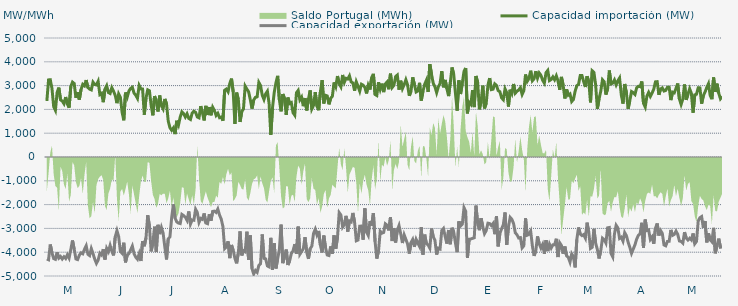
| Category | Capacidad importación (MW) | Capacidad exportación (MW) |
|---|---|---|
| 0 | 2355.417 | -4288.125 |
| 1900-01-01 | 3240.75 | -4318.125 |
| 1900-01-02 | 3247.5 | -3676.875 |
| 1900-01-03 | 2878.042 | -4025.625 |
| 1900-01-04 | 2109.167 | -4269.375 |
| 1900-01-05 | 1961.042 | -4299.375 |
| 1900-01-06 | 2710.208 | -4003.125 |
| 1900-01-07 | 2916 | -4248.333 |
| 1900-01-08 | 2401.875 | -4179.375 |
| 1900-01-09 | 2351.25 | -4286.25 |
| 1900-01-10 | 2238.75 | -4192.5 |
| 1900-01-11 | 2520 | -4265.625 |
| 1900-01-12 | 2227.5 | -4108.125 |
| 1900-01-13 | 2070.583 | -4246.875 |
| 1900-01-14 | 2958.75 | -3892.5 |
| 1900-01-15 | 3146.25 | -3508.125 |
| 1900-01-16 | 3087.5 | -3877.5 |
| 1900-01-17 | 2487.5 | -4284.375 |
| 1900-01-18 | 2722.5 | -4310.625 |
| 1900-01-19 | 2411.25 | -4125 |
| 1900-01-20 | 2840.5 | -4025.625 |
| 1900-01-21 | 3054.5 | -4066.875 |
| 1900-01-22 | 2992.958 | -3879.375 |
| 1900-01-23 | 3232.5 | -3729.375 |
| 1900-01-24 | 2917.5 | -4085.625 |
| 1900-01-25 | 2853.75 | -4141.875 |
| 1900-01-26 | 2819.458 | -3849.375 |
| 1900-01-27 | 3145.042 | -4061.25 |
| 1900-01-28 | 3046.958 | -4290 |
| 1900-01-29 | 3028.125 | -4468.125 |
| 1900-01-30 | 3180.542 | -4331.25 |
| 1900-01-31 | 2624.958 | -4042.5 |
| 1900-02-01 | 2676.25 | -4115.625 |
| 1900-02-02 | 2302.5 | -3873.75 |
| 1900-02-03 | 2854.208 | -4308.75 |
| 1900-02-04 | 2997.833 | -3837.167 |
| 1900-02-05 | 2709.375 | -3973.125 |
| 1900-02-06 | 2670 | -3712.958 |
| 1900-02-07 | 2913.75 | -3958.125 |
| 1900-02-08 | 2765.625 | -4134.375 |
| 1900-02-09 | 2587.5 | -3352.5 |
| 1900-02-10 | 2261.25 | -3093.75 |
| 1900-02-11 | 2651.25 | -3345.208 |
| 1900-02-12 | 2510.625 | -3963.75 |
| 1900-02-13 | 1885.875 | -4044.375 |
| 1900-02-14 | 1541.5 | -3601.375 |
| 1900-02-15 | 2707.5 | -4426.875 |
| 1900-02-16 | 2516.25 | -4128.75 |
| 1900-02-17 | 2775 | -4059.375 |
| 1900-02-18 | 2883.75 | -3906.667 |
| 1900-02-19 | 2930.625 | -3742.5 |
| 1900-02-20 | 2685 | -4061.25 |
| 1900-02-21 | 2596.875 | -4213.125 |
| 1900-02-22 | 2463.75 | -4295.625 |
| 1900-02-23 | 3005.625 | -4065 |
| 1900-02-24 | 2861.25 | -4370.625 |
| 1900-02-25 | 2855.083 | -3533.583 |
| 1900-02-26 | 1775.625 | -3751.875 |
| 1900-02-27 | 2478.75 | -3391.875 |
| 1900-02-28 | 2821.875 | -2444.375 |
| 1900-02-28 | 2782.5 | -2903.75 |
| 1900-03-01 | 2169.375 | -3964.667 |
| 1900-03-02 | 1751.292 | -3614.625 |
| 1900-03-03 | 2561.25 | -2926.875 |
| 1900-03-04 | 2356.875 | -3995.625 |
| 1900-03-05 | 1911.125 | -2849.625 |
| 1900-03-06 | 2583.75 | -3240 |
| 1900-03-07 | 2157.125 | -2962.917 |
| 1900-03-08 | 2021.375 | -3195.625 |
| 1900-03-09 | 2439.375 | -3776.25 |
| 1900-03-10 | 2235 | -4305 |
| 1900-03-11 | 1509.375 | -3436.875 |
| 1900-03-12 | 1230.208 | -3360 |
| 1900-03-13 | 1123.125 | -2546.875 |
| 1900-03-14 | 1221.25 | -1995.875 |
| 1900-03-15 | 962.083 | -2563.125 |
| 1900-03-16 | 1523.958 | -2728.125 |
| 1900-03-17 | 1344.375 | -2776.875 |
| 1900-03-18 | 1676.25 | -2795.625 |
| 1900-03-19 | 1899.375 | -2411.25 |
| 1900-03-20 | 1826.25 | -2461.875 |
| 1900-03-21 | 1680 | -2529.375 |
| 1900-03-22 | 1815 | -2662.5 |
| 1900-03-23 | 1621.458 | -2287.5 |
| 1900-03-24 | 1577.083 | -2818.125 |
| 1900-03-25 | 1846.875 | -2643.75 |
| 1900-03-26 | 1923.75 | -2656.875 |
| 1900-03-27 | 1875 | -2195.625 |
| 1900-03-28 | 1683.75 | -2330.625 |
| 1900-03-29 | 1646.25 | -2746.875 |
| 1900-03-30 | 2137.5 | -2580.5 |
| 1900-03-31 | 1860 | -2620.625 |
| 1900-04-01 | 1537.5 | -2371.875 |
| 1900-04-02 | 2149.292 | -2771.25 |
| 1900-04-03 | 1766.25 | -2801.25 |
| 1900-04-04 | 2097.75 | -2405.625 |
| 1900-04-05 | 1753.125 | -2676.75 |
| 1900-04-06 | 2090.625 | -2285.292 |
| 1900-04-07 | 1956.125 | -2274.75 |
| 1900-04-08 | 1743.75 | -2330.125 |
| 1900-04-09 | 1833.75 | -2185.875 |
| 1900-04-10 | 1651.875 | -2439.375 |
| 1900-04-11 | 1677 | -2608.125 |
| 1900-04-12 | 1526.25 | -2926.875 |
| 1900-04-13 | 2806.875 | -3847.5 |
| 1900-04-14 | 2853.75 | -3770.625 |
| 1900-04-15 | 2739.375 | -3542.5 |
| 1900-04-16 | 3086.25 | -4248.75 |
| 1900-04-17 | 3294.375 | -3694.583 |
| 1900-04-18 | 2737.5 | -3914.167 |
| 1900-04-19 | 1388.958 | -4258.125 |
| 1900-04-20 | 2705.625 | -4468.125 |
| 1900-04-21 | 2414.25 | -4032.292 |
| 1900-04-22 | 1474.5 | -3127.5 |
| 1900-04-23 | 1904.833 | -4134.375 |
| 1900-04-24 | 2018.333 | -3933.75 |
| 1900-04-25 | 2978.625 | -3980.625 |
| 1900-04-26 | 2851.875 | -3137.917 |
| 1900-04-27 | 2745 | -4327.5 |
| 1900-04-28 | 2411.25 | -3294.375 |
| 1900-04-29 | 2032.5 | -4693.125 |
| 1900-04-30 | 2394.375 | -4916.25 |
| 1900-05-01 | 2506.875 | -4770 |
| 1900-05-02 | 2527.5 | -4845 |
| 1900-05-03 | 3132.875 | -4556.25 |
| 1900-05-04 | 3001.875 | -4479.375 |
| 1900-05-05 | 2597 | -3253.75 |
| 1900-05-06 | 2415.833 | -4258.125 |
| 1900-05-07 | 2655 | -4284.375 |
| 1900-05-08 | 2764.458 | -4576.875 |
| 1900-05-09 | 2248.625 | -4616.25 |
| 1900-05-10 | 931.875 | -3396.042 |
| 1900-05-11 | 2074.792 | -4740 |
| 1900-05-12 | 2707.5 | -3624.375 |
| 1900-05-13 | 3118.125 | -4681.875 |
| 1900-05-14 | 3408.75 | -4280.625 |
| 1900-05-15 | 2415 | -3889.583 |
| 1900-05-16 | 1918.917 | -2840.25 |
| 1900-05-17 | 2645.125 | -4460.625 |
| 1900-05-18 | 2469.792 | -4186.875 |
| 1900-05-19 | 1772.542 | -3887.917 |
| 1900-05-20 | 2498.667 | -4538.125 |
| 1900-05-21 | 2245.542 | -4370 |
| 1900-05-22 | 2285.625 | -4056.25 |
| 1900-05-23 | 1862.708 | -3941.667 |
| 1900-05-24 | 1755.417 | -3663.125 |
| 1900-05-25 | 2699.583 | -4063.125 |
| 1900-05-26 | 2797.5 | -2925.625 |
| 1900-05-27 | 2403.333 | -4085.625 |
| 1900-05-28 | 2516.25 | -3971.25 |
| 1900-05-29 | 2135.625 | -3854.792 |
| 1900-05-30 | 2477.125 | -3369.292 |
| 1900-05-31 | 1956.292 | -3999.375 |
| 1900-06-01 | 2427.5 | -4280 |
| 1900-06-02 | 2798 | -3856.875 |
| 1900-06-03 | 2018.125 | -3744.583 |
| 1900-06-04 | 2168.958 | -3208.75 |
| 1900-06-05 | 2728.125 | -3034.375 |
| 1900-06-06 | 2131.75 | -3278.125 |
| 1900-06-07 | 1966.875 | -3106.458 |
| 1900-06-08 | 2738.083 | -3703.375 |
| 1900-06-09 | 3229.167 | -4012.5 |
| 1900-06-10 | 2249.792 | -3300.833 |
| 1900-06-11 | 2592.917 | -3809.792 |
| 1900-06-12 | 2566.25 | -4116.667 |
| 1900-06-13 | 2212.5 | -4138.708 |
| 1900-06-14 | 2464.375 | -3755.833 |
| 1900-06-15 | 2551.042 | -4061.25 |
| 1900-06-16 | 3133.5 | -3295.833 |
| 1900-06-17 | 2953.75 | -3854.167 |
| 1900-06-18 | 3401.25 | -3375.917 |
| 1900-06-19 | 3082.5 | -2336.25 |
| 1900-06-20 | 2949.375 | -2439.375 |
| 1900-06-21 | 3446.25 | -2947.5 |
| 1900-06-22 | 3138.75 | -2840.625 |
| 1900-06-23 | 3305 | -2472.958 |
| 1900-06-24 | 3276.125 | -3134.625 |
| 1900-06-25 | 3410.625 | -2685.417 |
| 1900-06-26 | 3153.75 | -2727.292 |
| 1900-06-27 | 3110.625 | -2351.25 |
| 1900-06-28 | 2786.458 | -2737.5 |
| 1900-06-29 | 3159.375 | -3519.375 |
| 1900-06-30 | 2974.6 | -3488.4 |
| 1900-07-01 | 2766.667 | -2906.917 |
| 1900-07-02 | 3058.125 | -2902.5 |
| 1900-07-03 | 3018.75 | -3474.375 |
| 1900-07-04 | 2925.625 | -2158.375 |
| 1900-07-05 | 2670.667 | -3157.5 |
| 1900-07-06 | 3015 | -3296.25 |
| 1900-07-07 | 2835.25 | -2693.125 |
| 1900-07-08 | 3337.5 | -2882.083 |
| 1900-07-09 | 3493.125 | -2358.75 |
| 1900-07-10 | 2626.042 | -3555 |
| 1900-07-11 | 2583.542 | -4267.5 |
| 1900-07-12 | 3140.625 | -3948.75 |
| 1900-07-13 | 2844.375 | -3122.5 |
| 1900-07-14 | 3082.5 | -3200.625 |
| 1900-07-15 | 2726.25 | -3170.625 |
| 1900-07-16 | 3071.25 | -2806.875 |
| 1900-07-17 | 3151.875 | -2865 |
| 1900-07-18 | 2845.417 | -3084.375 |
| 1900-07-19 | 3500.625 | -2536.875 |
| 1900-07-20 | 2921.75 | -3531.625 |
| 1900-07-21 | 3012.625 | -2985.75 |
| 1900-07-22 | 3378.75 | -3590.625 |
| 1900-07-23 | 3442.5 | -3078.75 |
| 1900-07-24 | 2829.167 | -2881.042 |
| 1900-07-25 | 3205.833 | -3234.375 |
| 1900-07-26 | 2873.625 | -3613.125 |
| 1900-07-27 | 3038.333 | -3270 |
| 1900-07-28 | 3245.625 | -3459.375 |
| 1900-07-29 | 3029.167 | -3656.25 |
| 1900-07-30 | 2571.042 | -4057.5 |
| 1900-07-31 | 2766.125 | -3596.417 |
| 1900-08-01 | 3348.75 | -3465 |
| 1900-08-02 | 3046.333 | -3774.375 |
| 1900-08-03 | 2732.708 | -3460.042 |
| 1900-08-04 | 2770.75 | -3616.875 |
| 1900-08-05 | 3116.25 | -3757.75 |
| 1900-08-06 | 2370.5 | -2949.375 |
| 1900-08-07 | 2758.625 | -4102.5 |
| 1900-08-08 | 3054.167 | -3262.5 |
| 1900-08-09 | 3221.875 | -3637.5 |
| 1900-08-10 | 2734.792 | -3695.625 |
| 1900-08-11 | 3901.875 | -3830.625 |
| 1900-08-12 | 3478.125 | -3007.5 |
| 1900-08-13 | 3100.208 | -3343.125 |
| 1900-08-14 | 2951.458 | -3500.625 |
| 1900-08-15 | 2703.125 | -4100.625 |
| 1900-08-16 | 2949.667 | -3832.5 |
| 1900-08-17 | 3092.292 | -3864.375 |
| 1900-08-18 | 3609.375 | -3088.125 |
| 1900-08-19 | 2928.75 | -3003.75 |
| 1900-08-20 | 3238.333 | -3346.875 |
| 1900-08-21 | 2865.417 | -3639.375 |
| 1900-08-22 | 2557.917 | -3067.5 |
| 1900-08-23 | 3131.667 | -3665.625 |
| 1900-08-24 | 3761.25 | -2973.625 |
| 1900-08-25 | 3468.542 | -3153.75 |
| 1900-08-26 | 2673.75 | -3622.5 |
| 1900-08-27 | 1945.625 | -3999.375 |
| 1900-08-28 | 3222.083 | -2703.875 |
| 1900-08-29 | 2645.458 | -2900.625 |
| 1900-08-30 | 3097.5 | -2827.5 |
| 1900-08-31 | 3595.208 | -2128.75 |
| 1900-09-01 | 3741.458 | -2283.75 |
| 1900-09-02 | 1833.125 | -4242.5 |
| 1900-09-03 | 2294.25 | -3457.125 |
| 1900-09-04 | 2210.833 | -3444.375 |
| 1900-09-05 | 2808.75 | -3420 |
| 1900-09-06 | 2098.083 | -3391.875 |
| 1900-09-07 | 3404.792 | -2041.875 |
| 1900-09-08 | 3136.875 | -2790.292 |
| 1900-09-09 | 2001.25 | -3075.75 |
| 1900-09-10 | 2334.583 | -2570.625 |
| 1900-09-11 | 2998.542 | -2932.5 |
| 1900-09-12 | 2041.583 | -3219.375 |
| 1900-09-13 | 2261.875 | -3091.875 |
| 1900-09-14 | 3017.292 | -2780.625 |
| 1900-09-15 | 3316.667 | -2796 |
| 1900-09-16 | 2831.875 | -2880.375 |
| 1900-09-17 | 2848.875 | -2791.375 |
| 1900-09-18 | 3072.083 | -3242.5 |
| 1900-09-19 | 3008.75 | -2494.125 |
| 1900-09-20 | 2789.75 | -3753.75 |
| 1900-09-21 | 2740.75 | -3208.125 |
| 1900-09-22 | 2484.167 | -3015 |
| 1900-09-23 | 2405.083 | -2845.208 |
| 1900-09-24 | 2862.542 | -2330.625 |
| 1900-09-25 | 2704.875 | -3693.75 |
| 1900-09-26 | 2121.458 | -2932.25 |
| 1900-09-27 | 2826.875 | -2536.458 |
| 1900-09-28 | 2666.25 | -2617.875 |
| 1900-09-29 | 3068.375 | -2797.625 |
| 1900-09-30 | 2681.458 | -3181.875 |
| 1900-10-01 | 2762.167 | -3268.125 |
| 1900-10-02 | 2816.458 | -3403.125 |
| 1900-10-03 | 2908.75 | -3388.125 |
| 1900-10-04 | 2628.458 | -3817.5 |
| 1900-10-05 | 2784.5 | -3729.375 |
| 1900-10-06 | 3466.875 | -2575.375 |
| 1900-10-07 | 3180 | -3284.375 |
| 1900-10-08 | 3301.25 | -3251.25 |
| 1900-10-09 | 3624.375 | -3114.375 |
| 1900-10-10 | 3203.333 | -3733.125 |
| 1900-10-11 | 3288.125 | -4155 |
| 1900-10-12 | 3606.25 | -3943.125 |
| 1900-10-13 | 3313.75 | -3335.625 |
| 1900-10-14 | 3531.417 | -3646.875 |
| 1900-10-15 | 3433.125 | -3826.875 |
| 1900-10-16 | 3223.542 | -3673.333 |
| 1900-10-17 | 3103.75 | -4066.875 |
| 1900-10-18 | 3546.25 | -3496.875 |
| 1900-10-19 | 3638.5 | -3952.5 |
| 1900-10-20 | 3210 | -3661.875 |
| 1900-10-21 | 3255.417 | -3826.875 |
| 1900-10-22 | 3367.5 | -3690 |
| 1900-10-23 | 3244.5 | -3684.375 |
| 1900-10-24 | 3411.458 | -3435 |
| 1900-10-25 | 3192.708 | -4203.75 |
| 1900-10-26 | 2825 | -3605.625 |
| 1900-10-27 | 3365.667 | -3718.625 |
| 1900-10-28 | 3014.375 | -4063.125 |
| 1900-10-29 | 2458.292 | -3762 |
| 1900-10-30 | 2845.5 | -4151.25 |
| 1900-10-31 | 2597.292 | -4215 |
| 1900-11-01 | 2650.375 | -4415.625 |
| 1900-11-02 | 2331.042 | -4066.875 |
| 1900-11-03 | 2415.625 | -4185 |
| 1900-11-04 | 2763.875 | -4638.75 |
| 1900-11-05 | 2996.042 | -3465 |
| 1900-11-06 | 3054.375 | -2960.625 |
| 1900-11-07 | 3421.875 | -3238.875 |
| 1900-11-08 | 3422.25 | -3301.458 |
| 1900-11-09 | 3168.75 | -3257.708 |
| 1900-11-10 | 2940.75 | -3407.5 |
| 1900-11-11 | 3391.875 | -2758.75 |
| 1900-11-12 | 3159.375 | -3175.208 |
| 1900-11-13 | 2294.792 | -3843.75 |
| 1900-11-14 | 3620.625 | -3793.125 |
| 1900-11-15 | 3550.208 | -3016.875 |
| 1900-11-16 | 3036.458 | -3616.875 |
| 1900-11-17 | 2023.333 | -3886.25 |
| 1900-11-18 | 2440.208 | -4263.75 |
| 1900-11-19 | 2764.167 | -3943.125 |
| 1900-11-20 | 3245.625 | -3410.667 |
| 1900-11-21 | 3161.25 | -3470.625 |
| 1900-11-22 | 2621.458 | -3614.625 |
| 1900-11-23 | 2861.25 | -2975.958 |
| 1900-11-24 | 3635.217 | -2962.391 |
| 1900-11-25 | 3071.083 | -4052.75 |
| 1900-11-26 | 3103.625 | -4196.25 |
| 1900-11-27 | 3238.125 | -3235.75 |
| 1900-11-28 | 3031.875 | -2868.708 |
| 1900-11-29 | 3202.5 | -2981.292 |
| 1900-11-30 | 3320.625 | -3422.292 |
| 1900-12-01 | 2615.625 | -3370.417 |
| 1900-12-02 | 2244.375 | -3535.625 |
| 1900-12-03 | 3067.5 | -3176.25 |
| 1900-12-04 | 2692.458 | -3306.875 |
| 1900-12-05 | 2025 | -3576.042 |
| 1900-12-06 | 2373.833 | -3795 |
| 1900-12-07 | 2750.458 | -4045 |
| 1900-12-08 | 2704.167 | -3868.417 |
| 1900-12-09 | 2628.75 | -3691.667 |
| 1900-12-10 | 2910 | -3448.125 |
| 1900-12-11 | 2971.875 | -3293.375 |
| 1900-12-12 | 2958.5 | -3229.167 |
| 1900-12-13 | 3174.375 | -2764.583 |
| 1900-12-14 | 2253.75 | -3813.75 |
| 1900-12-15 | 2100 | -2628.667 |
| 1900-12-16 | 2557.5 | -3088.333 |
| 1900-12-17 | 2713.125 | -3062.25 |
| 1900-12-18 | 2546.875 | -3463.625 |
| 1900-12-19 | 2686.458 | -3359.458 |
| 1900-12-20 | 2850 | -3646.042 |
| 1900-12-21 | 3159.375 | -2992.292 |
| 1900-12-22 | 3166.875 | -2793.125 |
| 1900-12-23 | 2613.75 | -3298.833 |
| 1900-12-24 | 2857.5 | -3089.625 |
| 1900-12-25 | 2903.875 | -3210.125 |
| 1900-12-26 | 2772 | -3696.792 |
| 1900-12-27 | 2797.5 | -3731.25 |
| 1900-12-28 | 2930.625 | -3545.625 |
| 1900-12-29 | 2932.5 | -3541.875 |
| 1900-12-30 | 2390.625 | -3064.167 |
| 1900-12-31 | 2726.25 | -3293.333 |
| 1901-01-01 | 2694.375 | -3252.708 |
| 1901-01-02 | 2878.125 | -3111.875 |
| 1901-01-03 | 3088.125 | -3247.5 |
| 1901-01-04 | 2435.625 | -3528.958 |
| 1901-01-05 | 2206.875 | -3547.708 |
| 1901-01-06 | 2435.625 | -3618.75 |
| 1901-01-07 | 3046.875 | -3157.917 |
| 1901-01-08 | 2400 | -3406.875 |
| 1901-01-09 | 2640 | -3488.125 |
| 1901-01-10 | 2866.875 | -3413.542 |
| 1901-01-11 | 2675.625 | -3486.458 |
| 1901-01-12 | 1861.25 | -3211.667 |
| 1901-01-13 | 2611.875 | -3644.375 |
| 1901-01-14 | 2638.125 | -3547.083 |
| 1901-01-15 | 2906.25 | -2688.333 |
| 1901-01-16 | 2904.375 | -2549.583 |
| 1901-01-17 | 2240.625 | -2502.083 |
| 1901-01-18 | 2576.25 | -2981.667 |
| 1901-01-19 | 2732.25 | -2689.375 |
| 1901-01-20 | 2919.375 | -3586.875 |
| 1901-01-21 | 3078.75 | -3206.25 |
| 1901-01-22 | 2587.5 | -3481.875 |
| 1901-01-23 | 2430 | -3560.625 |
| 1901-01-24 | 3341.25 | -2977.542 |
| 1901-01-25 | 2733.75 | -4046.25 |
| 1901-01-26 | 3080.625 | -3725.417 |
| 1901-01-27 | 2681.25 | -3429.375 |
| 1901-01-28 | 2448.75 | -3793.125 |
| 1901-01-29 | 2544.125 | -3778.125 |